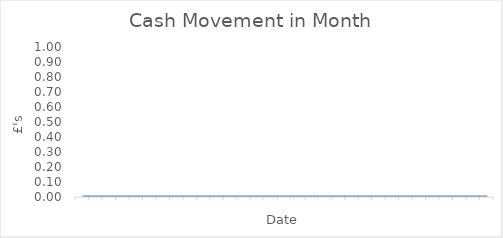
| Category | Series 0 |
|---|---|
| 0 | 0 |
| 1 | 0 |
| 2 | 0 |
| 3 | 0 |
| 4 | 0 |
| 5 | 0 |
| 6 | 0 |
| 7 | 0 |
| 8 | 0 |
| 9 | 0 |
| 10 | 0 |
| 11 | 0 |
| 12 | 0 |
| 13 | 0 |
| 14 | 0 |
| 15 | 0 |
| 16 | 0 |
| 17 | 0 |
| 18 | 0 |
| 19 | 0 |
| 20 | 0 |
| 21 | 0 |
| 22 | 0 |
| 23 | 0 |
| 24 | 0 |
| 25 | 0 |
| 26 | 0 |
| 27 | 0 |
| 28 | 0 |
| 29 | 0 |
| 30 | 0 |